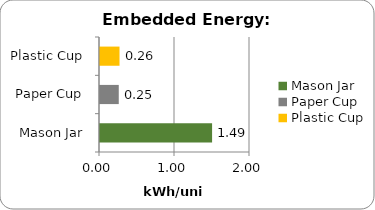
| Category | Series 0 |
|---|---|
| Mason Jar | 1.495 |
| Paper Cup | 0.25 |
| Plastic Cup | 0.26 |